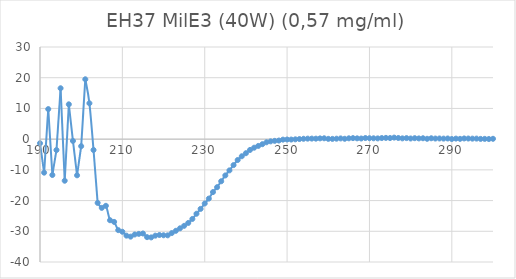
| Category | Series 0 |
|---|---|
| 300.0 | 0.115 |
| 299.0 | 0.042 |
| 298.0 | 0.089 |
| 297.0 | 0.082 |
| 296.0 | 0.176 |
| 295.0 | 0.163 |
| 294.0 | 0.201 |
| 293.0 | 0.221 |
| 292.0 | 0.096 |
| 291.0 | 0.172 |
| 290.0 | 0.042 |
| 289.0 | 0.214 |
| 288.0 | 0.171 |
| 287.0 | 0.221 |
| 286.0 | 0.197 |
| 285.0 | 0.287 |
| 284.0 | 0.117 |
| 283.0 | 0.287 |
| 282.0 | 0.237 |
| 281.0 | 0.31 |
| 280.0 | 0.215 |
| 279.0 | 0.339 |
| 278.0 | 0.253 |
| 277.0 | 0.373 |
| 276.0 | 0.498 |
| 275.0 | 0.354 |
| 274.0 | 0.408 |
| 273.0 | 0.353 |
| 272.0 | 0.247 |
| 271.0 | 0.274 |
| 270.0 | 0.303 |
| 269.0 | 0.359 |
| 268.0 | 0.208 |
| 267.0 | 0.261 |
| 266.0 | 0.331 |
| 265.0 | 0.268 |
| 264.0 | 0.122 |
| 263.0 | 0.234 |
| 262.0 | 0.143 |
| 261.0 | 0.084 |
| 260.0 | 0.097 |
| 259.0 | 0.279 |
| 258.0 | 0.247 |
| 257.0 | 0.16 |
| 256.0 | 0.176 |
| 255.0 | 0.163 |
| 254.0 | 0.119 |
| 253.0 | 0.032 |
| 252.0 | -0.062 |
| 251.0 | -0.134 |
| 250.0 | -0.119 |
| 249.0 | -0.157 |
| 248.0 | -0.453 |
| 247.0 | -0.556 |
| 246.0 | -0.724 |
| 245.0 | -1.025 |
| 244.0 | -1.644 |
| 243.0 | -2.208 |
| 242.0 | -2.786 |
| 241.0 | -3.516 |
| 240.0 | -4.581 |
| 239.0 | -5.568 |
| 238.0 | -6.798 |
| 237.0 | -8.449 |
| 236.0 | -10.173 |
| 235.0 | -11.818 |
| 234.0 | -13.712 |
| 233.0 | -15.652 |
| 232.0 | -17.245 |
| 231.0 | -19.358 |
| 230.0 | -20.948 |
| 229.0 | -22.706 |
| 228.0 | -24.286 |
| 227.0 | -25.984 |
| 226.0 | -27.285 |
| 225.0 | -28.226 |
| 224.0 | -29.033 |
| 223.0 | -29.839 |
| 222.0 | -30.581 |
| 221.0 | -31.319 |
| 220.0 | -31.297 |
| 219.0 | -31.213 |
| 218.0 | -31.423 |
| 217.0 | -31.994 |
| 216.0 | -31.909 |
| 215.0 | -30.722 |
| 214.0 | -30.843 |
| 213.0 | -31.045 |
| 212.0 | -31.747 |
| 211.0 | -31.418 |
| 210.0 | -30.152 |
| 209.0 | -29.625 |
| 208.0 | -26.946 |
| 207.0 | -26.402 |
| 206.0 | -21.708 |
| 205.0 | -22.38 |
| 204.0 | -20.761 |
| 203.0 | -3.53 |
| 202.0 | 11.678 |
| 201.0 | 19.487 |
| 200.0 | -2.284 |
| 199.0 | -11.775 |
| 198.0 | -0.588 |
| 197.0 | 11.338 |
| 196.0 | -13.539 |
| 195.0 | 16.57 |
| 194.0 | -3.551 |
| 193.0 | -11.674 |
| 192.0 | 9.783 |
| 191.0 | -10.918 |
| 190.0 | -1.333 |